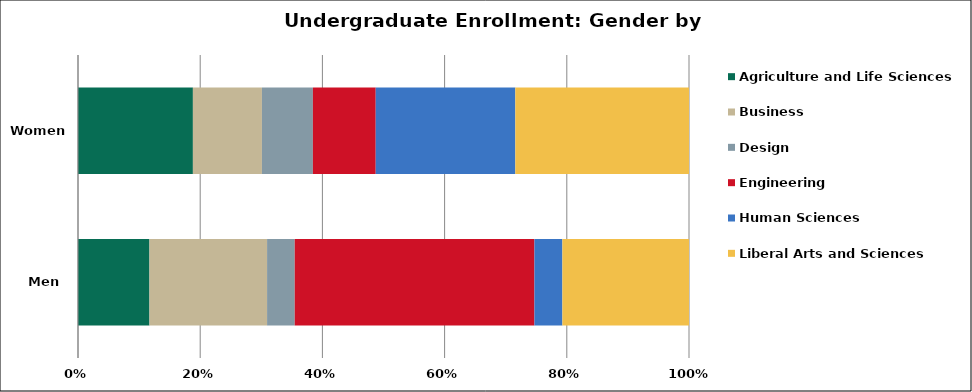
| Category | Agriculture and Life Sciences | Business | Design | Engineering | Human Sciences | Liberal Arts and Sciences |
|---|---|---|---|---|---|---|
| Men | 1894 | 3118 | 733 | 6354 | 741 | 3356 |
| Women | 2275 | 1367 | 1009 | 1244 | 2764 | 3439 |